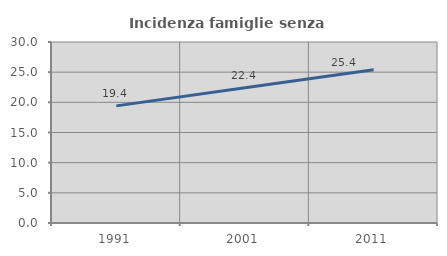
| Category | Incidenza famiglie senza nuclei |
|---|---|
| 1991.0 | 19.412 |
| 2001.0 | 22.406 |
| 2011.0 | 25.404 |